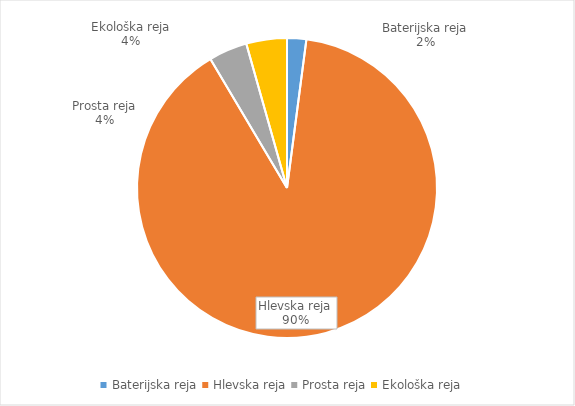
| Category | Količina kosov jajc |
|---|---|
| Baterijska reja | 50440 |
| Hlevska reja | 2181785 |
| Prosta reja | 101370 |
| Ekološka reja | 106780 |